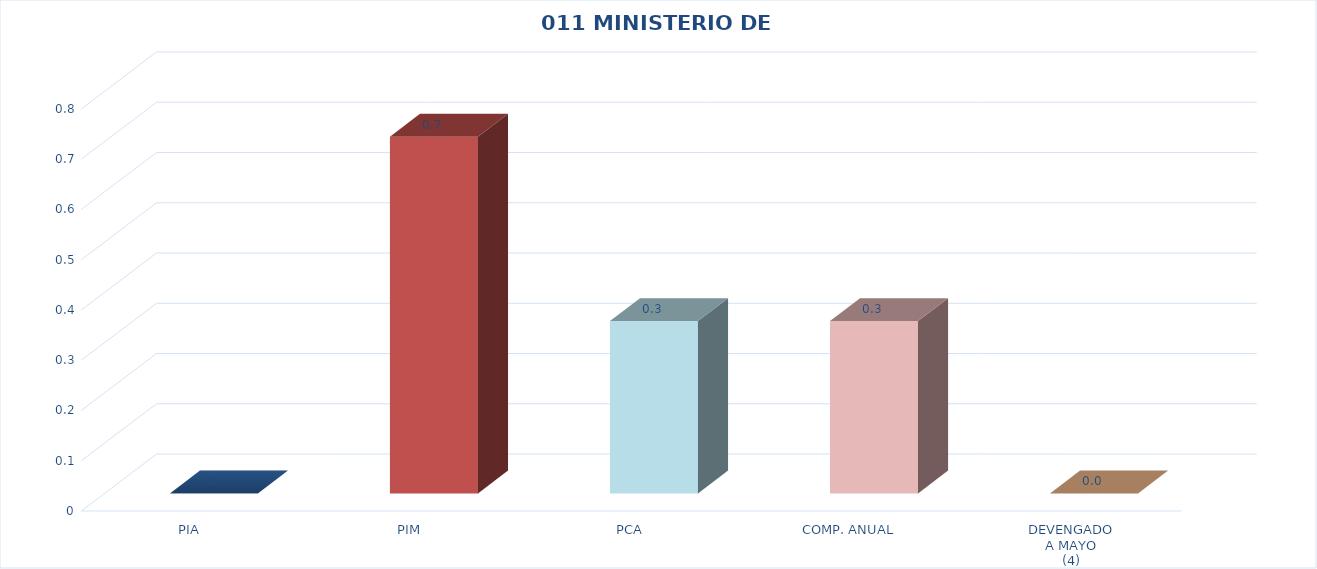
| Category | 011 MINISTERIO DE SALUD |
|---|---|
| PIA | 0 |
| PIM | 0.71 |
| PCA | 0.343 |
| COMP. ANUAL | 0.343 |
| DEVENGADO
A MAYO
(4) | 0 |